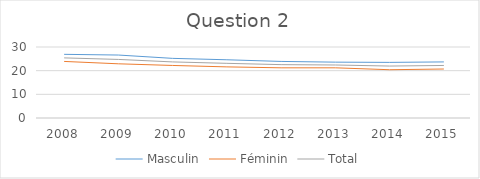
| Category | Masculin | Féminin | Total |
|---|---|---|---|
| 2008.0 | 26.9 | 23.9 | 25.4 |
| 2009.0 | 26.6 | 22.9 | 24.75 |
| 2010.0 | 25.2 | 22.2 | 23.7 |
| 2011.0 | 24.6 | 21.6 | 23.1 |
| 2012.0 | 23.9 | 21.2 | 22.55 |
| 2013.0 | 23.6 | 21.2 | 22.4 |
| 2014.0 | 23.5 | 20.4 | 21.95 |
| 2015.0 | 23.7 | 20.7 | 22.2 |